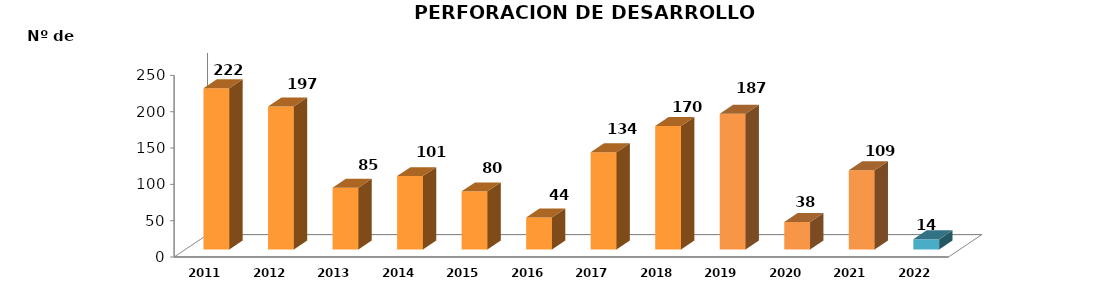
| Category | Series 0 |
|---|---|
| 2011.0 | 222 |
| 2012.0 | 197 |
| 2013.0 | 85 |
| 2014.0 | 101 |
| 2015.0 | 80 |
| 2016.0 | 44 |
| 2017.0 | 134 |
| 2018.0 | 170 |
| 2019.0 | 187 |
| 2020.0 | 38 |
| 2021.0 | 109 |
| 2022.0 | 14 |